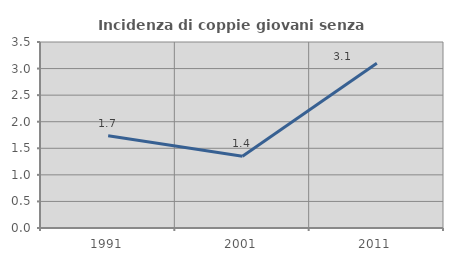
| Category | Incidenza di coppie giovani senza figli |
|---|---|
| 1991.0 | 1.734 |
| 2001.0 | 1.351 |
| 2011.0 | 3.101 |